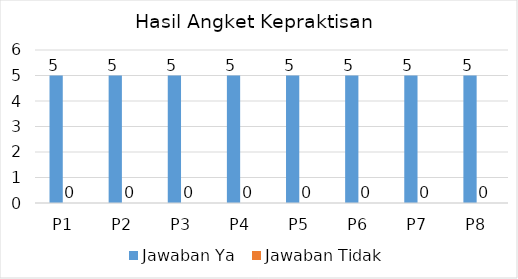
| Category | Jawaban Ya  | Jawaban Tidak |
|---|---|---|
| P1 | 5 | 0 |
| P2 | 5 | 0 |
| P3 | 5 | 0 |
| P4 | 5 | 0 |
| P5 | 5 | 0 |
| P6 | 5 | 0 |
| P7 | 5 | 0 |
| P8 | 5 | 0 |